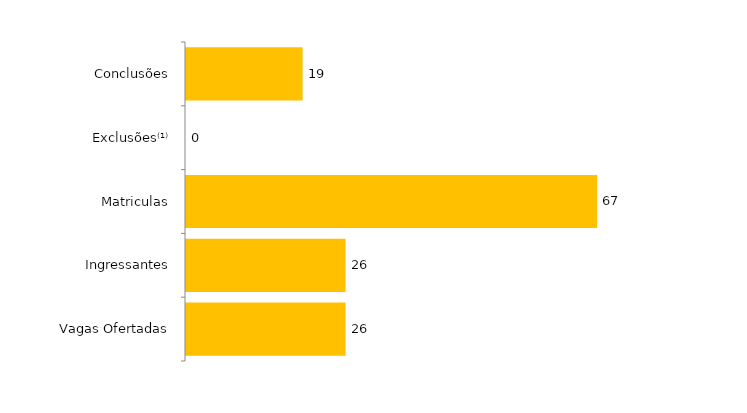
| Category | Total (2014) |
|---|---|
| Vagas Ofertadas | 26 |
| Ingressantes | 26 |
| Matriculas | 67 |
| Exclusões⁽¹⁾ | 0 |
| Conclusões | 19 |